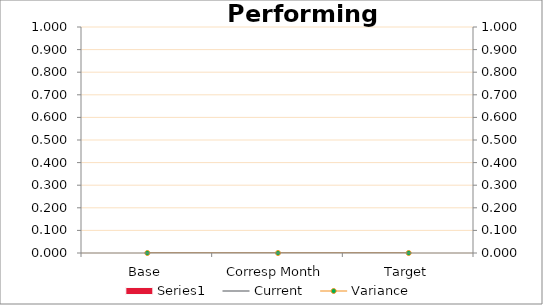
| Category | Series 0 |
|---|---|
| Base | 0 |
| Corresp Month | 0 |
| Target | 0 |